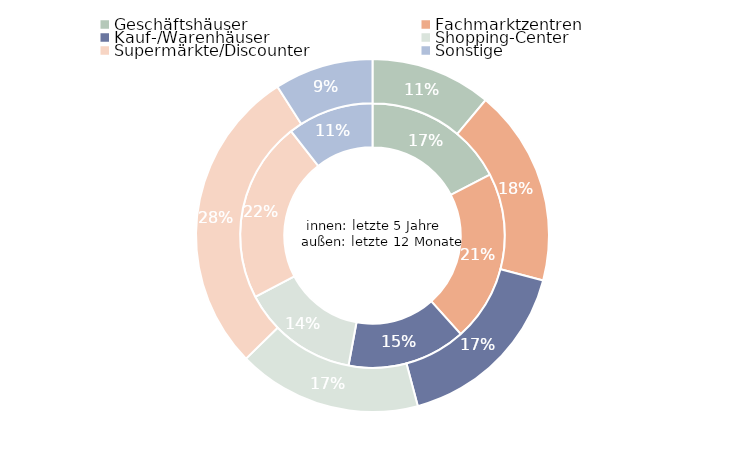
| Category | Series 1 | Series 0 |
|---|---|---|
| Geschäftshäuser | 1757924226.678 | 765605300 |
| Fachmarktzentren | 2123795405.176 | 1246357299 |
| Kauf-/Warenhäuser | 1467467919.152 | 1159499997.99 |
| Shopping-Center | 1459255629.652 | 1164629084 |
| Supermärkte/Discounter | 2235955540.628 | 1952509083.3 |
| Sonstige | 1066925490.262 | 625211997 |